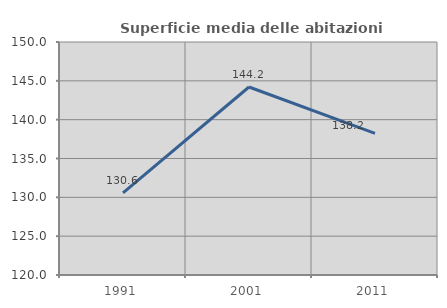
| Category | Superficie media delle abitazioni occupate |
|---|---|
| 1991.0 | 130.585 |
| 2001.0 | 144.204 |
| 2011.0 | 138.234 |